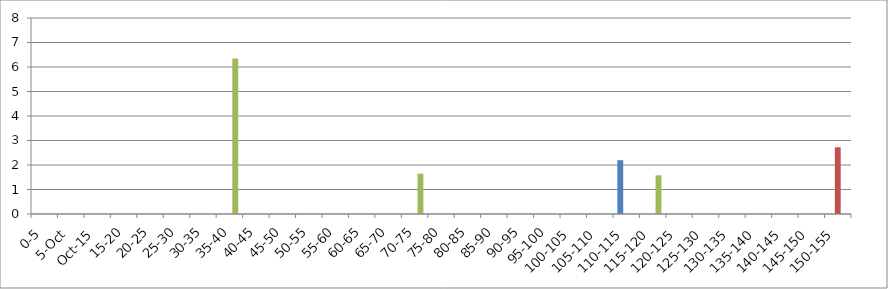
| Category | 119875 | 146067 | 241240 |
|---|---|---|---|
| 0-5 | 0 | 0 | 0 |
| 5-Oct | 0 | 0 | 0 |
| Oct-15 | 0 | 0 | 0 |
| 15-20 | 0 | 0 | 0 |
| 20-25 | 0 | 0 | 0 |
| 25-30 | 0 | 0 | 0 |
| 30-35 | 0 | 0 | 0 |
| 35-40 | 0 | 0 | 6.347 |
| 40-45 | 0 | 0 | 0 |
| 45-50 | 0 | 0 | 0 |
| 50-55 | 0 | 0 | 0 |
| 55-60 | 0 | 0 | 0 |
| 60-65 | 0 | 0 | 0 |
| 65-70 | 0 | 0 | 0 |
| 70-75 | 0 | 0 | 1.647 |
| 75-80 | 0 | 0 | 0 |
| 80-85 | 0 | 0 | 0 |
| 85-90 | 0 | 0 | 0 |
| 90-95 | 0 | 0 | 0 |
| 95-100 | 0 | 0 | 0 |
| 100-105 | 0 | 0 | 0 |
| 105-110 | 0 | 0 | 0 |
| 110-115 | 2.196 | 0 | 0 |
| 115-120 | 0 | 0 | 1.581 |
| 120-125 | 0 | 0 | 0 |
| 125-130 | 0 | 0 | 0 |
| 130-135 | 0 | 0 | 0 |
| 135-140 | 0 | 0 | 0 |
| 140-145 | 0 | 0 | 0 |
| 145-150 | 0 | 0 | 0 |
| 150-155 | 0 | 2.723 | 0 |